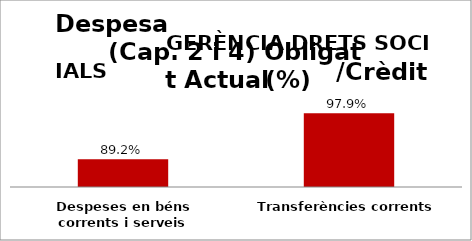
| Category | Series 0 |
|---|---|
| Despeses en béns corrents i serveis | 0.892 |
| Transferències corrents | 0.979 |